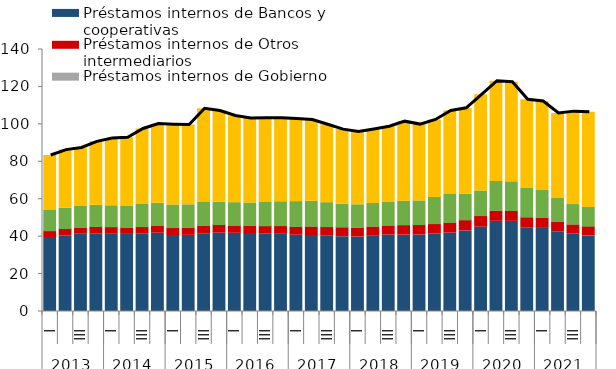
| Category | Préstamos internos de Bancos y cooperativas | Préstamos internos de Otros intermediarios | Préstamos internos de Gobierno | Bonos emitidos en Chile | Títulos, préstamos y otras cuentas en el exterior  |
|---|---|---|---|---|---|
| 0 | 39.49 | 3.329 | 0.326 | 11.154 | 29.072 |
| 1 | 40.541 | 3.444 | 0.335 | 10.953 | 30.952 |
| 2 | 41.265 | 3.408 | 0.346 | 11.092 | 31.256 |
| 3 | 41.564 | 3.486 | 0.354 | 11.368 | 33.885 |
| 4 | 41.482 | 3.433 | 0.348 | 11.24 | 35.932 |
| 5 | 41.199 | 3.49 | 0.355 | 11.383 | 36.363 |
| 6 | 41.295 | 3.684 | 0.369 | 11.852 | 40.326 |
| 7 | 41.826 | 3.74 | 0.374 | 11.895 | 42.301 |
| 8 | 40.611 | 3.881 | 0.363 | 12.075 | 42.911 |
| 9 | 40.677 | 3.957 | 0.364 | 12.006 | 42.63 |
| 10 | 41.525 | 4.081 | 0.388 | 12.255 | 50.1 |
| 11 | 41.899 | 4.158 | 0.401 | 11.898 | 48.792 |
| 12 | 41.78 | 4.002 | 0.389 | 11.995 | 46.286 |
| 13 | 41.678 | 3.998 | 0.39 | 11.929 | 45.117 |
| 14 | 41.378 | 4.028 | 0.39 | 12.509 | 44.907 |
| 15 | 41.257 | 4.177 | 0.434 | 12.793 | 44.564 |
| 16 | 40.825 | 4.201 | 0.415 | 13.275 | 44.111 |
| 17 | 40.559 | 4.684 | 0.41 | 13.23 | 43.47 |
| 18 | 40.22 | 4.722 | 0.404 | 12.829 | 41.618 |
| 19 | 39.981 | 4.833 | 0.418 | 12.194 | 39.766 |
| 20 | 39.837 | 4.762 | 0.407 | 12.031 | 38.878 |
| 21 | 40.416 | 4.821 | 0.404 | 12.136 | 39.463 |
| 22 | 40.885 | 4.905 | 0.404 | 12.34 | 40.199 |
| 23 | 40.804 | 5.133 | 0.404 | 12.623 | 42.477 |
| 24 | 40.891 | 5.156 | 0.391 | 12.664 | 40.776 |
| 25 | 41.396 | 5.156 | 0.402 | 13.968 | 41.425 |
| 26 | 41.926 | 5.262 | 0.412 | 14.929 | 44.595 |
| 27 | 43.03 | 5.561 | 0.438 | 13.721 | 45.841 |
| 28 | 45.096 | 5.699 | 0.443 | 13.16 | 51.363 |
| 29 | 48.193 | 5.493 | 0.484 | 15.302 | 53.602 |
| 30 | 48.175 | 5.292 | 0.491 | 15.346 | 53.23 |
| 31 | 44.76 | 5.382 | 0.478 | 15.131 | 47.419 |
| 32 | 44.399 | 5.387 | 0.472 | 14.402 | 47.539 |
| 33 | 42.45 | 5.254 | 0.42 | 12.277 | 45.447 |
| 34 | 41.393 | 4.96 | 0.389 | 10.41 | 49.648 |
| 35 | 40.397 | 4.943 | 0.357 | 9.868 | 50.883 |